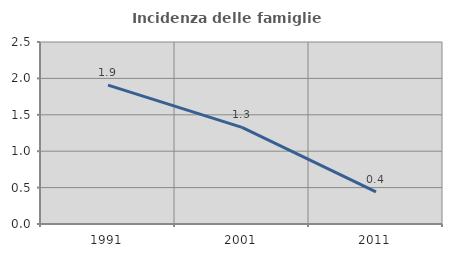
| Category | Incidenza delle famiglie numerose |
|---|---|
| 1991.0 | 1.908 |
| 2001.0 | 1.326 |
| 2011.0 | 0.442 |